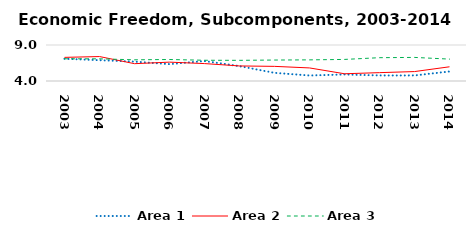
| Category | Area 1 | Area 2 | Area 3 |
|---|---|---|---|
| 2003.0 | 7.088 | 7.283 | 7.088 |
| 2004.0 | 6.892 | 7.395 | 7.079 |
| 2005.0 | 6.69 | 6.405 | 6.943 |
| 2006.0 | 6.342 | 6.62 | 6.986 |
| 2007.0 | 6.775 | 6.419 | 6.88 |
| 2008.0 | 6.062 | 6.09 | 6.871 |
| 2009.0 | 5.134 | 6.032 | 6.912 |
| 2010.0 | 4.765 | 5.815 | 6.935 |
| 2011.0 | 4.904 | 5.006 | 6.996 |
| 2012.0 | 4.772 | 5.16 | 7.238 |
| 2013.0 | 4.773 | 5.309 | 7.276 |
| 2014.0 | 5.323 | 5.974 | 7.04 |